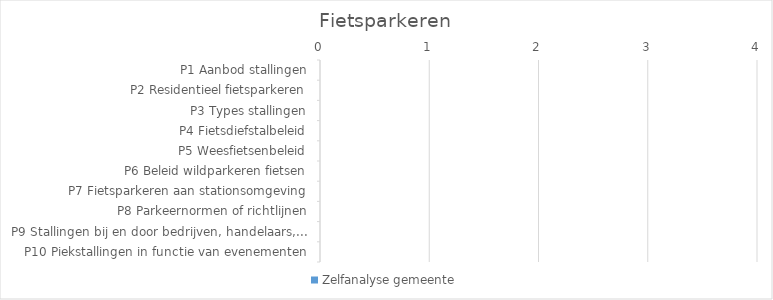
| Category | Zelfanalyse gemeente |
|---|---|
| P1 Aanbod stallingen | 0 |
| P2 Residentieel fietsparkeren | 0 |
| P3 Types stallingen | 0 |
| P4 Fietsdiefstalbeleid | 0 |
| P5 Weesfietsenbeleid | 0 |
| P6 Beleid wildparkeren fietsen | 0 |
| P7 Fietsparkeren aan stationsomgeving | 0 |
| P8 Parkeernormen of richtlijnen | 0 |
| P9 Stallingen bij en door bedrijven, handelaars,... | 0 |
| P10 Piekstallingen in functie van evenementen | 0 |